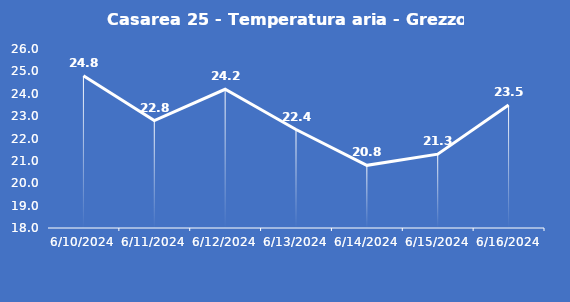
| Category | Casarea 25 - Temperatura aria - Grezzo (°C) |
|---|---|
| 6/10/24 | 24.8 |
| 6/11/24 | 22.8 |
| 6/12/24 | 24.2 |
| 6/13/24 | 22.4 |
| 6/14/24 | 20.8 |
| 6/15/24 | 21.3 |
| 6/16/24 | 23.5 |